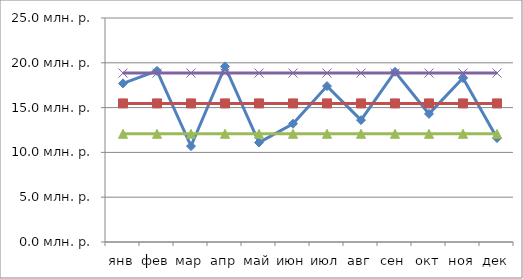
| Category | Объем дебиторской задолженности | Среднее значение | Среднее - сигма | Среднее + сигма |
|---|---|---|---|---|
| янв | 17700000 | 15466666.667 | 12078899.01 | 18854434.324 |
| фев | 19100000 | 15466666.667 | 12078899.01 | 18854434.324 |
| мар | 10700000 | 15466666.667 | 12078899.01 | 18854434.324 |
| апр | 19600000 | 15466666.667 | 12078899.01 | 18854434.324 |
| май | 11100000 | 15466666.667 | 12078899.01 | 18854434.324 |
| июн | 13200000 | 15466666.667 | 12078899.01 | 18854434.324 |
| июл | 17400000 | 15466666.667 | 12078899.01 | 18854434.324 |
| авг | 13600000 | 15466666.667 | 12078899.01 | 18854434.324 |
| сен | 19000000 | 15466666.667 | 12078899.01 | 18854434.324 |
| окт | 14300000 | 15466666.667 | 12078899.01 | 18854434.324 |
| ноя | 18300000 | 15466666.667 | 12078899.01 | 18854434.324 |
| дек | 11600000 | 15466666.667 | 12078899.01 | 18854434.324 |